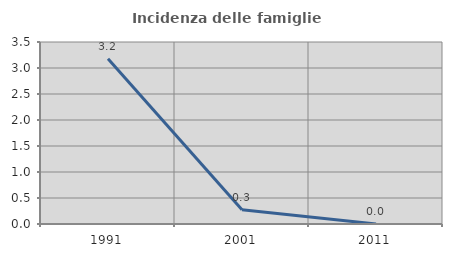
| Category | Incidenza delle famiglie numerose |
|---|---|
| 1991.0 | 3.179 |
| 2001.0 | 0.273 |
| 2011.0 | 0 |